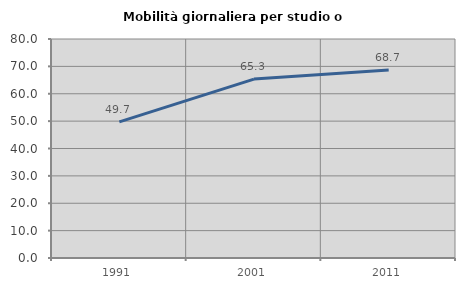
| Category | Mobilità giornaliera per studio o lavoro |
|---|---|
| 1991.0 | 49.735 |
| 2001.0 | 65.347 |
| 2011.0 | 68.686 |